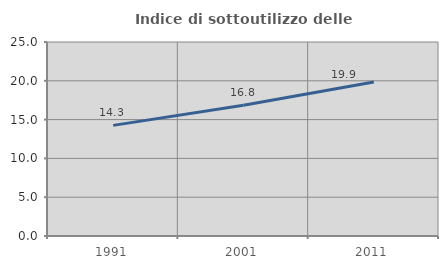
| Category | Indice di sottoutilizzo delle abitazioni  |
|---|---|
| 1991.0 | 14.257 |
| 2001.0 | 16.844 |
| 2011.0 | 19.856 |